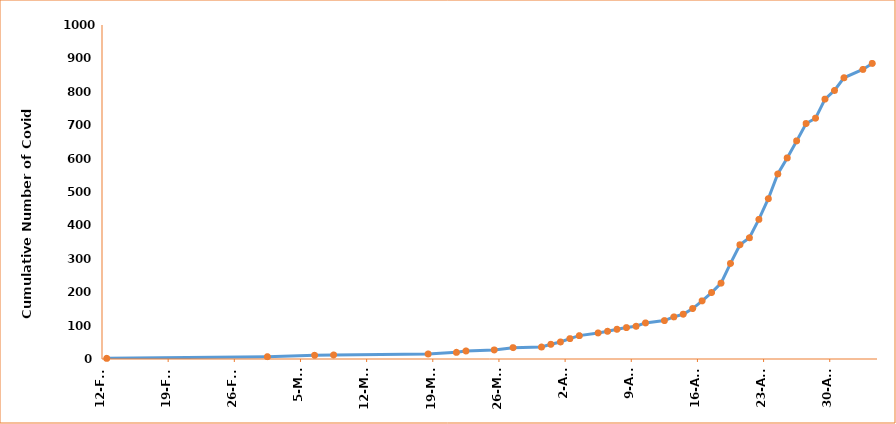
| Category | Series 0 |
|---|---|
| 2021-02-12 | 2 |
| 2021-03-01 | 7 |
| 2021-03-06 | 11 |
| 2021-03-08 | 12 |
| 2021-03-18 | 15 |
| 2021-03-21 | 20 |
| 2021-03-22 | 24 |
| 2021-03-25 | 27 |
| 2021-03-27 | 34 |
| 2021-03-30 | 36 |
| 2021-03-31 | 44 |
| 2021-04-01 | 51 |
| 2021-04-02 | 61 |
| 2021-04-03 | 70 |
| 2021-04-05 | 78 |
| 2021-04-06 | 83 |
| 2021-04-07 | 89 |
| 2021-04-08 | 94 |
| 2021-04-09 | 98 |
| 2021-04-10 | 108 |
| 2021-04-12 | 115 |
| 2021-04-13 | 126 |
| 2021-04-14 | 134 |
| 2021-04-15 | 151 |
| 2021-04-16 | 174 |
| 2021-04-17 | 199 |
| 2021-04-18 | 227 |
| 2021-04-19 | 286 |
| 2021-04-20 | 342 |
| 2021-04-21 | 363 |
| 2021-04-22 | 418 |
| 2021-04-23 | 480 |
| 2021-04-24 | 554 |
| 2021-04-25 | 602 |
| 2021-04-26 | 653 |
| 2021-04-27 | 705 |
| 2021-04-28 | 721 |
| 2021-04-29 | 778 |
| 2021-04-30 | 804 |
| 2021-05-01 | 842 |
| 2021-05-03 | 867 |
| 2021-05-04 | 885 |